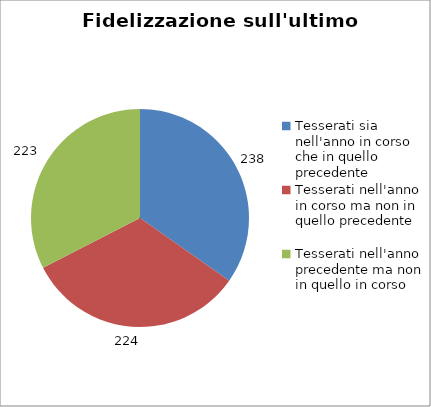
| Category | Nr. Tesserati |
|---|---|
| Tesserati sia nell'anno in corso che in quello precedente | 238 |
| Tesserati nell'anno in corso ma non in quello precedente | 224 |
| Tesserati nell'anno precedente ma non in quello in corso | 223 |